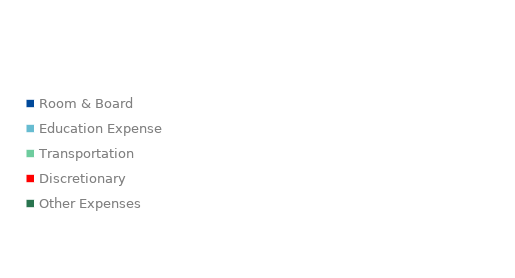
| Category | MONTHLY EXPENSE |
|---|---|
| Room & Board | 0 |
| Education Expense | 0 |
| Transportation | 0 |
| Discretionary | 0 |
| Other Expenses | 0 |